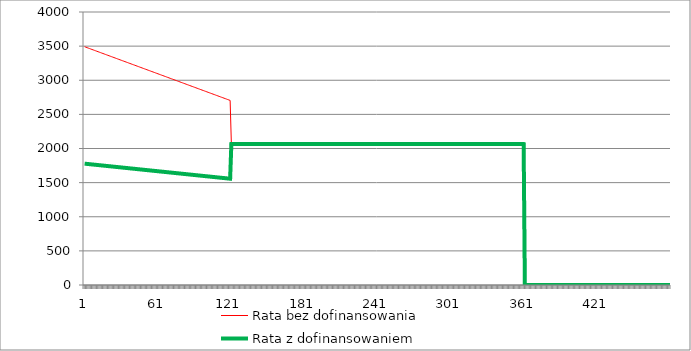
| Category | Rata bez dofinansowania | Rata z dofinansowaniem |
|---|---|---|
| 0 | 3491.12 | 1777.79 |
| 1 | 3484.51 | 1775.94 |
| 2 | 3477.9 | 1774.09 |
| 3 | 3471.29 | 1772.23 |
| 4 | 3464.68 | 1770.38 |
| 5 | 3458.06 | 1768.52 |
| 6 | 3451.45 | 1766.67 |
| 7 | 3444.84 | 1764.82 |
| 8 | 3438.23 | 1762.97 |
| 9 | 3431.62 | 1761.12 |
| 10 | 3425.01 | 1759.27 |
| 11 | 3418.4 | 1757.42 |
| 12 | 3411.79 | 1755.57 |
| 13 | 3405.17 | 1753.71 |
| 14 | 3398.56 | 1751.86 |
| 15 | 3391.95 | 1750.01 |
| 16 | 3385.34 | 1748.16 |
| 17 | 3378.73 | 1746.3 |
| 18 | 3372.12 | 1744.45 |
| 19 | 3365.51 | 1742.6 |
| 20 | 3358.9 | 1740.75 |
| 21 | 3352.29 | 1738.9 |
| 22 | 3345.67 | 1737.04 |
| 23 | 3339.06 | 1735.19 |
| 24 | 3332.45 | 1733.34 |
| 25 | 3325.84 | 1731.49 |
| 26 | 3319.23 | 1729.64 |
| 27 | 3312.62 | 1727.79 |
| 28 | 3306.01 | 1725.94 |
| 29 | 3299.4 | 1724.09 |
| 30 | 3292.79 | 1722.24 |
| 31 | 3286.17 | 1720.37 |
| 32 | 3279.56 | 1718.52 |
| 33 | 3272.95 | 1716.67 |
| 34 | 3266.34 | 1714.82 |
| 35 | 3259.73 | 1712.97 |
| 36 | 3253.12 | 1711.12 |
| 37 | 3246.51 | 1709.27 |
| 38 | 3239.9 | 1707.42 |
| 39 | 3233.28 | 1705.56 |
| 40 | 3226.67 | 1703.71 |
| 41 | 3220.06 | 1701.86 |
| 42 | 3213.45 | 1700.01 |
| 43 | 3206.84 | 1698.16 |
| 44 | 3200.23 | 1696.31 |
| 45 | 3193.62 | 1694.46 |
| 46 | 3187.01 | 1692.6 |
| 47 | 3180.4 | 1690.75 |
| 48 | 3173.78 | 1688.89 |
| 49 | 3167.17 | 1687.04 |
| 50 | 3160.56 | 1685.19 |
| 51 | 3153.95 | 1683.34 |
| 52 | 3147.34 | 1681.49 |
| 53 | 3140.73 | 1679.64 |
| 54 | 3134.12 | 1677.79 |
| 55 | 3127.51 | 1675.94 |
| 56 | 3120.89 | 1674.08 |
| 57 | 3114.28 | 1672.23 |
| 58 | 3107.67 | 1670.38 |
| 59 | 3101.06 | 1668.53 |
| 60 | 3094.45 | 1666.67 |
| 61 | 3087.84 | 1664.82 |
| 62 | 3081.23 | 1662.97 |
| 63 | 3074.62 | 1661.12 |
| 64 | 3068.01 | 1659.27 |
| 65 | 3061.39 | 1657.41 |
| 66 | 3054.78 | 1655.56 |
| 67 | 3048.17 | 1653.71 |
| 68 | 3041.56 | 1651.86 |
| 69 | 3034.95 | 1650.01 |
| 70 | 3028.34 | 1648.16 |
| 71 | 3021.73 | 1646.31 |
| 72 | 3015.12 | 1644.46 |
| 73 | 3008.51 | 1642.61 |
| 74 | 3001.89 | 1640.74 |
| 75 | 2995.28 | 1638.89 |
| 76 | 2988.67 | 1637.04 |
| 77 | 2982.06 | 1635.19 |
| 78 | 2975.45 | 1633.34 |
| 79 | 2968.84 | 1631.49 |
| 80 | 2962.23 | 1629.64 |
| 81 | 2955.62 | 1627.79 |
| 82 | 2949 | 1625.93 |
| 83 | 2942.39 | 1624.08 |
| 84 | 2935.78 | 1622.23 |
| 85 | 2929.17 | 1620.38 |
| 86 | 2922.56 | 1618.53 |
| 87 | 2915.95 | 1616.68 |
| 88 | 2909.34 | 1614.82 |
| 89 | 2902.73 | 1612.97 |
| 90 | 2896.12 | 1611.12 |
| 91 | 2889.5 | 1609.26 |
| 92 | 2882.89 | 1607.41 |
| 93 | 2876.28 | 1605.56 |
| 94 | 2869.67 | 1603.71 |
| 95 | 2863.06 | 1601.86 |
| 96 | 2856.45 | 1600.01 |
| 97 | 2849.84 | 1598.16 |
| 98 | 2843.23 | 1596.31 |
| 99 | 2836.61 | 1594.45 |
| 100 | 2830 | 1592.6 |
| 101 | 2823.39 | 1590.75 |
| 102 | 2816.78 | 1588.89 |
| 103 | 2810.17 | 1587.04 |
| 104 | 2803.56 | 1585.19 |
| 105 | 2796.95 | 1583.34 |
| 106 | 2790.34 | 1581.49 |
| 107 | 2783.73 | 1579.64 |
| 108 | 2777.11 | 1577.78 |
| 109 | 2770.5 | 1575.93 |
| 110 | 2763.89 | 1574.08 |
| 111 | 2757.28 | 1572.23 |
| 112 | 2750.67 | 1570.38 |
| 113 | 2744.06 | 1568.53 |
| 114 | 2737.45 | 1566.68 |
| 115 | 2730.84 | 1564.83 |
| 116 | 2724.22 | 1562.97 |
| 117 | 2717.61 | 1561.11 |
| 118 | 2711 | 1559.26 |
| 119 | 2704.39 | 1557.41 |
| 120 | 2067.46 | 2067.46 |
| 121 | 2067.46 | 2067.46 |
| 122 | 2067.46 | 2067.46 |
| 123 | 2067.46 | 2067.46 |
| 124 | 2067.46 | 2067.46 |
| 125 | 2067.46 | 2067.46 |
| 126 | 2067.46 | 2067.46 |
| 127 | 2067.46 | 2067.46 |
| 128 | 2067.46 | 2067.46 |
| 129 | 2067.46 | 2067.46 |
| 130 | 2067.46 | 2067.46 |
| 131 | 2067.46 | 2067.46 |
| 132 | 2067.46 | 2067.46 |
| 133 | 2067.46 | 2067.46 |
| 134 | 2067.46 | 2067.46 |
| 135 | 2067.46 | 2067.46 |
| 136 | 2067.46 | 2067.46 |
| 137 | 2067.46 | 2067.46 |
| 138 | 2067.46 | 2067.46 |
| 139 | 2067.46 | 2067.46 |
| 140 | 2067.46 | 2067.46 |
| 141 | 2067.46 | 2067.46 |
| 142 | 2067.46 | 2067.46 |
| 143 | 2067.46 | 2067.46 |
| 144 | 2067.46 | 2067.46 |
| 145 | 2067.46 | 2067.46 |
| 146 | 2067.46 | 2067.46 |
| 147 | 2067.46 | 2067.46 |
| 148 | 2067.46 | 2067.46 |
| 149 | 2067.46 | 2067.46 |
| 150 | 2067.46 | 2067.46 |
| 151 | 2067.46 | 2067.46 |
| 152 | 2067.46 | 2067.46 |
| 153 | 2067.46 | 2067.46 |
| 154 | 2067.46 | 2067.46 |
| 155 | 2067.46 | 2067.46 |
| 156 | 2067.46 | 2067.46 |
| 157 | 2067.46 | 2067.46 |
| 158 | 2067.46 | 2067.46 |
| 159 | 2067.46 | 2067.46 |
| 160 | 2067.46 | 2067.46 |
| 161 | 2067.46 | 2067.46 |
| 162 | 2067.46 | 2067.46 |
| 163 | 2067.46 | 2067.46 |
| 164 | 2067.46 | 2067.46 |
| 165 | 2067.46 | 2067.46 |
| 166 | 2067.46 | 2067.46 |
| 167 | 2067.46 | 2067.46 |
| 168 | 2067.46 | 2067.46 |
| 169 | 2067.46 | 2067.46 |
| 170 | 2067.46 | 2067.46 |
| 171 | 2067.46 | 2067.46 |
| 172 | 2067.46 | 2067.46 |
| 173 | 2067.46 | 2067.46 |
| 174 | 2067.46 | 2067.46 |
| 175 | 2067.46 | 2067.46 |
| 176 | 2067.46 | 2067.46 |
| 177 | 2067.46 | 2067.46 |
| 178 | 2067.46 | 2067.46 |
| 179 | 2067.46 | 2067.46 |
| 180 | 2067.46 | 2067.46 |
| 181 | 2067.46 | 2067.46 |
| 182 | 2067.46 | 2067.46 |
| 183 | 2067.46 | 2067.46 |
| 184 | 2067.46 | 2067.46 |
| 185 | 2067.46 | 2067.46 |
| 186 | 2067.46 | 2067.46 |
| 187 | 2067.46 | 2067.46 |
| 188 | 2067.46 | 2067.46 |
| 189 | 2067.46 | 2067.46 |
| 190 | 2067.46 | 2067.46 |
| 191 | 2067.46 | 2067.46 |
| 192 | 2067.46 | 2067.46 |
| 193 | 2067.46 | 2067.46 |
| 194 | 2067.46 | 2067.46 |
| 195 | 2067.46 | 2067.46 |
| 196 | 2067.46 | 2067.46 |
| 197 | 2067.46 | 2067.46 |
| 198 | 2067.46 | 2067.46 |
| 199 | 2067.46 | 2067.46 |
| 200 | 2067.46 | 2067.46 |
| 201 | 2067.46 | 2067.46 |
| 202 | 2067.46 | 2067.46 |
| 203 | 2067.46 | 2067.46 |
| 204 | 2067.46 | 2067.46 |
| 205 | 2067.46 | 2067.46 |
| 206 | 2067.46 | 2067.46 |
| 207 | 2067.46 | 2067.46 |
| 208 | 2067.46 | 2067.46 |
| 209 | 2067.46 | 2067.46 |
| 210 | 2067.46 | 2067.46 |
| 211 | 2067.46 | 2067.46 |
| 212 | 2067.46 | 2067.46 |
| 213 | 2067.46 | 2067.46 |
| 214 | 2067.46 | 2067.46 |
| 215 | 2067.46 | 2067.46 |
| 216 | 2067.46 | 2067.46 |
| 217 | 2067.46 | 2067.46 |
| 218 | 2067.46 | 2067.46 |
| 219 | 2067.46 | 2067.46 |
| 220 | 2067.46 | 2067.46 |
| 221 | 2067.46 | 2067.46 |
| 222 | 2067.46 | 2067.46 |
| 223 | 2067.46 | 2067.46 |
| 224 | 2067.46 | 2067.46 |
| 225 | 2067.46 | 2067.46 |
| 226 | 2067.46 | 2067.46 |
| 227 | 2067.46 | 2067.46 |
| 228 | 2067.46 | 2067.46 |
| 229 | 2067.46 | 2067.46 |
| 230 | 2067.46 | 2067.46 |
| 231 | 2067.46 | 2067.46 |
| 232 | 2067.46 | 2067.46 |
| 233 | 2067.46 | 2067.46 |
| 234 | 2067.46 | 2067.46 |
| 235 | 2067.46 | 2067.46 |
| 236 | 2067.46 | 2067.46 |
| 237 | 2067.46 | 2067.46 |
| 238 | 2067.46 | 2067.46 |
| 239 | 2067.46 | 2067.46 |
| 240 | 2067.46 | 2067.46 |
| 241 | 2067.46 | 2067.46 |
| 242 | 2067.46 | 2067.46 |
| 243 | 2067.46 | 2067.46 |
| 244 | 2067.46 | 2067.46 |
| 245 | 2067.46 | 2067.46 |
| 246 | 2067.46 | 2067.46 |
| 247 | 2067.46 | 2067.46 |
| 248 | 2067.46 | 2067.46 |
| 249 | 2067.46 | 2067.46 |
| 250 | 2067.46 | 2067.46 |
| 251 | 2067.46 | 2067.46 |
| 252 | 2067.46 | 2067.46 |
| 253 | 2067.46 | 2067.46 |
| 254 | 2067.46 | 2067.46 |
| 255 | 2067.46 | 2067.46 |
| 256 | 2067.46 | 2067.46 |
| 257 | 2067.46 | 2067.46 |
| 258 | 2067.46 | 2067.46 |
| 259 | 2067.46 | 2067.46 |
| 260 | 2067.46 | 2067.46 |
| 261 | 2067.46 | 2067.46 |
| 262 | 2067.46 | 2067.46 |
| 263 | 2067.46 | 2067.46 |
| 264 | 2067.46 | 2067.46 |
| 265 | 2067.46 | 2067.46 |
| 266 | 2067.46 | 2067.46 |
| 267 | 2067.46 | 2067.46 |
| 268 | 2067.46 | 2067.46 |
| 269 | 2067.46 | 2067.46 |
| 270 | 2067.46 | 2067.46 |
| 271 | 2067.46 | 2067.46 |
| 272 | 2067.46 | 2067.46 |
| 273 | 2067.46 | 2067.46 |
| 274 | 2067.46 | 2067.46 |
| 275 | 2067.46 | 2067.46 |
| 276 | 2067.46 | 2067.46 |
| 277 | 2067.46 | 2067.46 |
| 278 | 2067.46 | 2067.46 |
| 279 | 2067.46 | 2067.46 |
| 280 | 2067.46 | 2067.46 |
| 281 | 2067.46 | 2067.46 |
| 282 | 2067.46 | 2067.46 |
| 283 | 2067.46 | 2067.46 |
| 284 | 2067.46 | 2067.46 |
| 285 | 2067.46 | 2067.46 |
| 286 | 2067.46 | 2067.46 |
| 287 | 2067.46 | 2067.46 |
| 288 | 2067.46 | 2067.46 |
| 289 | 2067.46 | 2067.46 |
| 290 | 2067.46 | 2067.46 |
| 291 | 2067.46 | 2067.46 |
| 292 | 2067.46 | 2067.46 |
| 293 | 2067.46 | 2067.46 |
| 294 | 2067.46 | 2067.46 |
| 295 | 2067.46 | 2067.46 |
| 296 | 2067.46 | 2067.46 |
| 297 | 2067.46 | 2067.46 |
| 298 | 2067.46 | 2067.46 |
| 299 | 2067.46 | 2067.46 |
| 300 | 2067.46 | 2067.46 |
| 301 | 2067.46 | 2067.46 |
| 302 | 2067.46 | 2067.46 |
| 303 | 2067.46 | 2067.46 |
| 304 | 2067.46 | 2067.46 |
| 305 | 2067.46 | 2067.46 |
| 306 | 2067.46 | 2067.46 |
| 307 | 2067.46 | 2067.46 |
| 308 | 2067.46 | 2067.46 |
| 309 | 2067.46 | 2067.46 |
| 310 | 2067.46 | 2067.46 |
| 311 | 2067.46 | 2067.46 |
| 312 | 2067.46 | 2067.46 |
| 313 | 2067.46 | 2067.46 |
| 314 | 2067.46 | 2067.46 |
| 315 | 2067.46 | 2067.46 |
| 316 | 2067.46 | 2067.46 |
| 317 | 2067.46 | 2067.46 |
| 318 | 2067.46 | 2067.46 |
| 319 | 2067.46 | 2067.46 |
| 320 | 2067.46 | 2067.46 |
| 321 | 2067.46 | 2067.46 |
| 322 | 2067.46 | 2067.46 |
| 323 | 2067.46 | 2067.46 |
| 324 | 2067.46 | 2067.46 |
| 325 | 2067.46 | 2067.46 |
| 326 | 2067.46 | 2067.46 |
| 327 | 2067.46 | 2067.46 |
| 328 | 2067.46 | 2067.46 |
| 329 | 2067.46 | 2067.46 |
| 330 | 2067.46 | 2067.46 |
| 331 | 2067.46 | 2067.46 |
| 332 | 2067.46 | 2067.46 |
| 333 | 2067.46 | 2067.46 |
| 334 | 2067.46 | 2067.46 |
| 335 | 2067.46 | 2067.46 |
| 336 | 2067.46 | 2067.46 |
| 337 | 2067.46 | 2067.46 |
| 338 | 2067.46 | 2067.46 |
| 339 | 2067.46 | 2067.46 |
| 340 | 2067.46 | 2067.46 |
| 341 | 2067.46 | 2067.46 |
| 342 | 2067.46 | 2067.46 |
| 343 | 2067.46 | 2067.46 |
| 344 | 2067.46 | 2067.46 |
| 345 | 2067.46 | 2067.46 |
| 346 | 2067.46 | 2067.46 |
| 347 | 2067.46 | 2067.46 |
| 348 | 2067.46 | 2067.46 |
| 349 | 2067.46 | 2067.46 |
| 350 | 2067.46 | 2067.46 |
| 351 | 2067.46 | 2067.46 |
| 352 | 2067.46 | 2067.46 |
| 353 | 2067.46 | 2067.46 |
| 354 | 2067.46 | 2067.46 |
| 355 | 2067.46 | 2067.46 |
| 356 | 2067.46 | 2067.46 |
| 357 | 2067.46 | 2067.46 |
| 358 | 2067.46 | 2067.46 |
| 359 | 2065.31 | 2065.31 |
| 360 | 0 | 0 |
| 361 | 0 | 0 |
| 362 | 0 | 0 |
| 363 | 0 | 0 |
| 364 | 0 | 0 |
| 365 | 0 | 0 |
| 366 | 0 | 0 |
| 367 | 0 | 0 |
| 368 | 0 | 0 |
| 369 | 0 | 0 |
| 370 | 0 | 0 |
| 371 | 0 | 0 |
| 372 | 0 | 0 |
| 373 | 0 | 0 |
| 374 | 0 | 0 |
| 375 | 0 | 0 |
| 376 | 0 | 0 |
| 377 | 0 | 0 |
| 378 | 0 | 0 |
| 379 | 0 | 0 |
| 380 | 0 | 0 |
| 381 | 0 | 0 |
| 382 | 0 | 0 |
| 383 | 0 | 0 |
| 384 | 0 | 0 |
| 385 | 0 | 0 |
| 386 | 0 | 0 |
| 387 | 0 | 0 |
| 388 | 0 | 0 |
| 389 | 0 | 0 |
| 390 | 0 | 0 |
| 391 | 0 | 0 |
| 392 | 0 | 0 |
| 393 | 0 | 0 |
| 394 | 0 | 0 |
| 395 | 0 | 0 |
| 396 | 0 | 0 |
| 397 | 0 | 0 |
| 398 | 0 | 0 |
| 399 | 0 | 0 |
| 400 | 0 | 0 |
| 401 | 0 | 0 |
| 402 | 0 | 0 |
| 403 | 0 | 0 |
| 404 | 0 | 0 |
| 405 | 0 | 0 |
| 406 | 0 | 0 |
| 407 | 0 | 0 |
| 408 | 0 | 0 |
| 409 | 0 | 0 |
| 410 | 0 | 0 |
| 411 | 0 | 0 |
| 412 | 0 | 0 |
| 413 | 0 | 0 |
| 414 | 0 | 0 |
| 415 | 0 | 0 |
| 416 | 0 | 0 |
| 417 | 0 | 0 |
| 418 | 0 | 0 |
| 419 | 0 | 0 |
| 420 | 0 | 0 |
| 421 | 0 | 0 |
| 422 | 0 | 0 |
| 423 | 0 | 0 |
| 424 | 0 | 0 |
| 425 | 0 | 0 |
| 426 | 0 | 0 |
| 427 | 0 | 0 |
| 428 | 0 | 0 |
| 429 | 0 | 0 |
| 430 | 0 | 0 |
| 431 | 0 | 0 |
| 432 | 0 | 0 |
| 433 | 0 | 0 |
| 434 | 0 | 0 |
| 435 | 0 | 0 |
| 436 | 0 | 0 |
| 437 | 0 | 0 |
| 438 | 0 | 0 |
| 439 | 0 | 0 |
| 440 | 0 | 0 |
| 441 | 0 | 0 |
| 442 | 0 | 0 |
| 443 | 0 | 0 |
| 444 | 0 | 0 |
| 445 | 0 | 0 |
| 446 | 0 | 0 |
| 447 | 0 | 0 |
| 448 | 0 | 0 |
| 449 | 0 | 0 |
| 450 | 0 | 0 |
| 451 | 0 | 0 |
| 452 | 0 | 0 |
| 453 | 0 | 0 |
| 454 | 0 | 0 |
| 455 | 0 | 0 |
| 456 | 0 | 0 |
| 457 | 0 | 0 |
| 458 | 0 | 0 |
| 459 | 0 | 0 |
| 460 | 0 | 0 |
| 461 | 0 | 0 |
| 462 | 0 | 0 |
| 463 | 0 | 0 |
| 464 | 0 | 0 |
| 465 | 0 | 0 |
| 466 | 0 | 0 |
| 467 | 0 | 0 |
| 468 | 0 | 0 |
| 469 | 0 | 0 |
| 470 | 0 | 0 |
| 471 | 0 | 0 |
| 472 | 0 | 0 |
| 473 | 0 | 0 |
| 474 | 0 | 0 |
| 475 | 0 | 0 |
| 476 | 0 | 0 |
| 477 | 0 | 0 |
| 478 | 0 | 0 |
| 479 | 0 | 0 |